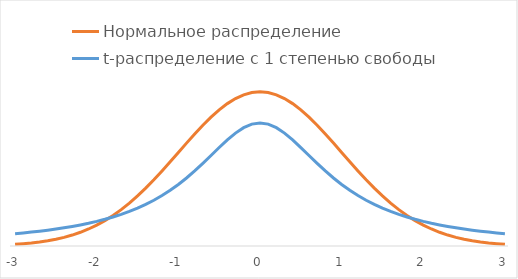
| Category | Нормальное распределение | t-распределение с 1 степенью свободы |
|---|---|---|
| -3.0 | 0.004 | 0.032 |
| -2.9 | 0.006 | 0.034 |
| -2.8 | 0.008 | 0.036 |
| -2.6999999999999997 | 0.01 | 0.038 |
| -2.5999999999999996 | 0.014 | 0.041 |
| -2.4999999999999996 | 0.018 | 0.044 |
| -2.3999999999999995 | 0.022 | 0.047 |
| -2.2999999999999994 | 0.028 | 0.051 |
| -2.1999999999999993 | 0.035 | 0.055 |
| -2.099999999999999 | 0.044 | 0.059 |
| -1.9999999999999991 | 0.054 | 0.064 |
| -1.899999999999999 | 0.066 | 0.069 |
| -1.799999999999999 | 0.079 | 0.075 |
| -1.6999999999999988 | 0.094 | 0.082 |
| -1.5999999999999988 | 0.111 | 0.089 |
| -1.4999999999999987 | 0.13 | 0.098 |
| -1.3999999999999986 | 0.15 | 0.108 |
| -1.2999999999999985 | 0.171 | 0.118 |
| -1.1999999999999984 | 0.194 | 0.13 |
| -1.0999999999999983 | 0.218 | 0.144 |
| -0.9999999999999983 | 0.242 | 0.159 |
| -0.8999999999999984 | 0.266 | 0.176 |
| -0.7999999999999984 | 0.29 | 0.194 |
| -0.6999999999999984 | 0.312 | 0.214 |
| -0.5999999999999984 | 0.333 | 0.234 |
| -0.49999999999999845 | 0.352 | 0.255 |
| -0.39999999999999847 | 0.368 | 0.274 |
| -0.2999999999999985 | 0.381 | 0.292 |
| -0.19999999999999848 | 0.391 | 0.306 |
| -0.09999999999999848 | 0.397 | 0.315 |
| 0.0 | 0.399 | 0.318 |
| 0.1 | 0.397 | 0.315 |
| 0.2 | 0.391 | 0.306 |
| 0.30000000000000004 | 0.381 | 0.292 |
| 0.4 | 0.368 | 0.274 |
| 0.5 | 0.352 | 0.255 |
| 0.6 | 0.333 | 0.234 |
| 0.7 | 0.312 | 0.214 |
| 0.7999999999999999 | 0.29 | 0.194 |
| 0.8999999999999999 | 0.266 | 0.176 |
| 0.9999999999999999 | 0.242 | 0.159 |
| 1.0999999999999999 | 0.218 | 0.144 |
| 1.2 | 0.194 | 0.13 |
| 1.3 | 0.171 | 0.118 |
| 1.4000000000000001 | 0.15 | 0.108 |
| 1.5000000000000002 | 0.13 | 0.098 |
| 1.6000000000000003 | 0.111 | 0.089 |
| 1.7000000000000004 | 0.094 | 0.082 |
| 1.8000000000000005 | 0.079 | 0.075 |
| 1.9000000000000006 | 0.066 | 0.069 |
| 2.0000000000000004 | 0.054 | 0.064 |
| 2.1000000000000005 | 0.044 | 0.059 |
| 2.2000000000000006 | 0.035 | 0.055 |
| 2.3000000000000007 | 0.028 | 0.051 |
| 2.400000000000001 | 0.022 | 0.047 |
| 2.500000000000001 | 0.018 | 0.044 |
| 2.600000000000001 | 0.014 | 0.041 |
| 2.700000000000001 | 0.01 | 0.038 |
| 2.800000000000001 | 0.008 | 0.036 |
| 2.9000000000000012 | 0.006 | 0.034 |
| 3.0000000000000013 | 0.004 | 0.032 |